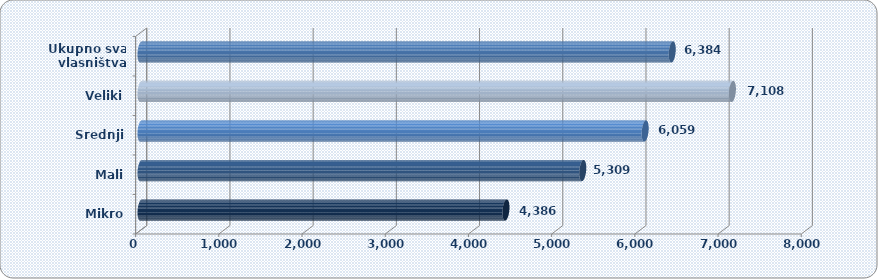
| Category | Prosječna mjesečna neto plaća po zaposlenom |
|---|---|
| Mikro | 4386.091 |
| Mali | 5309.242 |
| Srednji | 6059.356 |
| Veliki | 7107.747 |
| Ukupno sva
 vlasništva | 6384.496 |